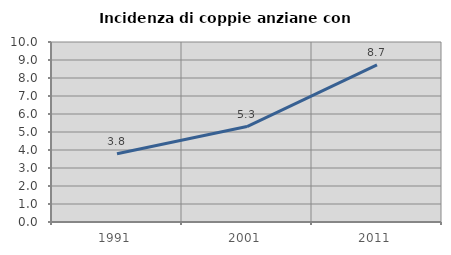
| Category | Incidenza di coppie anziane con figli |
|---|---|
| 1991.0 | 3.788 |
| 2001.0 | 5.303 |
| 2011.0 | 8.73 |